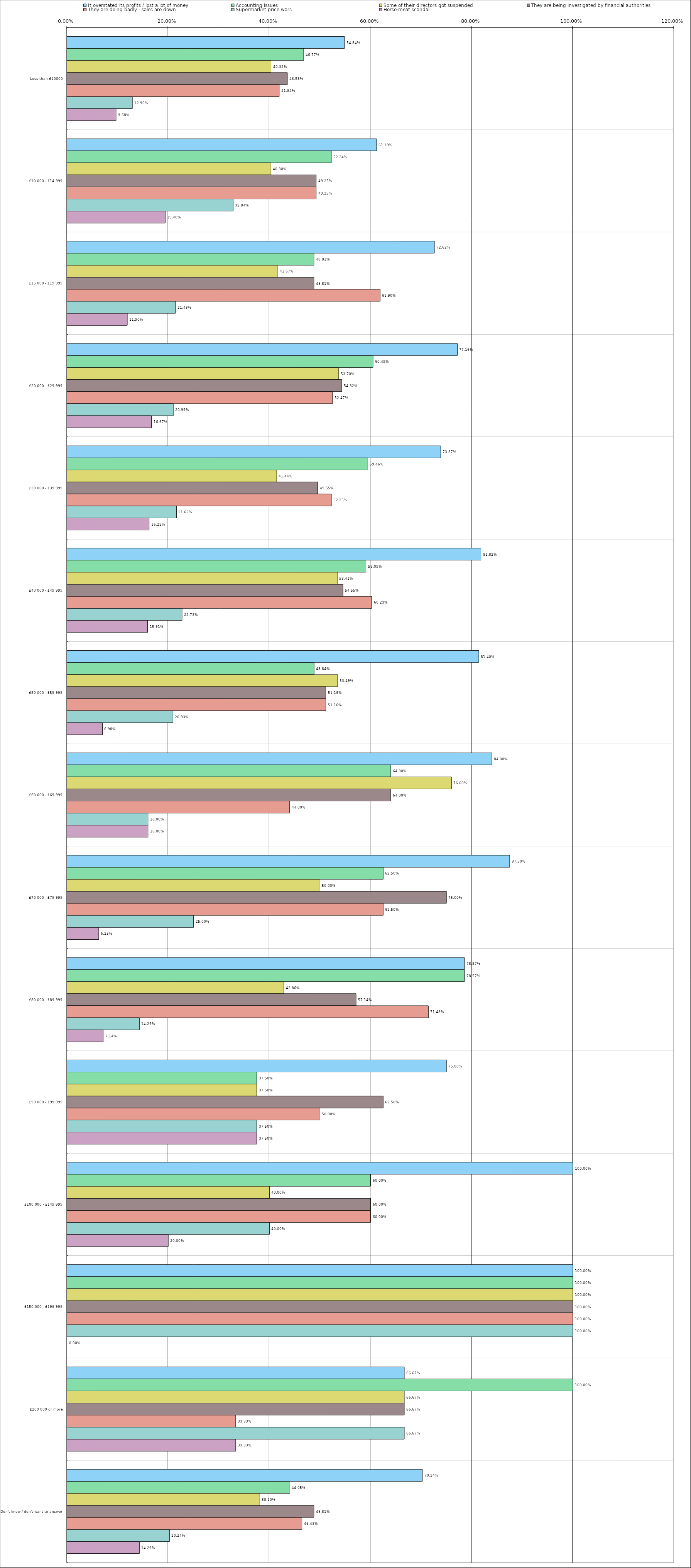
| Category | It overstated its profits / lost a lot of money | Accounting issues | Some of their directors got suspended | They are being investigated by financial authorities | They are doing badly - sales are down | Supermarket price wars | Horse-meat scandal |
|---|---|---|---|---|---|---|---|
| 0 | 0.548 | 0.468 | 0.403 | 0.436 | 0.419 | 0.129 | 0.097 |
| 1 | 0.612 | 0.522 | 0.403 | 0.492 | 0.492 | 0.328 | 0.194 |
| 2 | 0.726 | 0.488 | 0.417 | 0.488 | 0.619 | 0.214 | 0.119 |
| 3 | 0.772 | 0.605 | 0.537 | 0.543 | 0.525 | 0.21 | 0.167 |
| 4 | 0.739 | 0.595 | 0.414 | 0.496 | 0.522 | 0.216 | 0.162 |
| 5 | 0.818 | 0.591 | 0.534 | 0.546 | 0.602 | 0.227 | 0.159 |
| 6 | 0.814 | 0.488 | 0.535 | 0.512 | 0.512 | 0.209 | 0.07 |
| 7 | 0.84 | 0.64 | 0.76 | 0.64 | 0.44 | 0.16 | 0.16 |
| 8 | 0.875 | 0.625 | 0.5 | 0.75 | 0.625 | 0.25 | 0.062 |
| 9 | 0.786 | 0.786 | 0.429 | 0.571 | 0.714 | 0.143 | 0.071 |
| 10 | 0.75 | 0.375 | 0.375 | 0.625 | 0.5 | 0.375 | 0.375 |
| 11 | 1 | 0.6 | 0.4 | 0.6 | 0.6 | 0.4 | 0.2 |
| 12 | 1 | 1 | 1 | 1 | 1 | 1 | 0 |
| 13 | 0.667 | 1 | 0.667 | 0.667 | 0.333 | 0.667 | 0.333 |
| 14 | 0.702 | 0.44 | 0.381 | 0.488 | 0.464 | 0.202 | 0.143 |